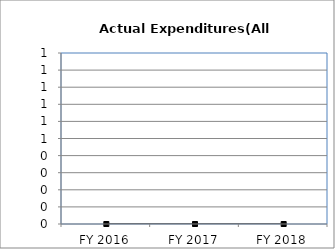
| Category | Actual Expenditures(All Funds) |
|---|---|
| FY 2016 | 0 |
| FY 2017 | 0 |
| FY 2018 | 0 |